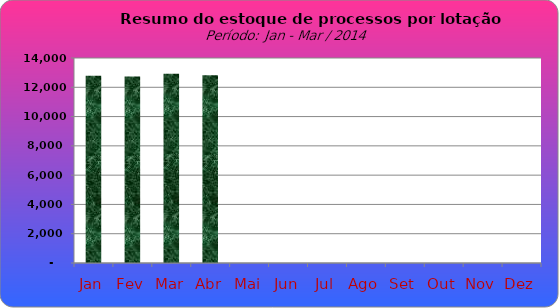
| Category | Series 0 |
|---|---|
| Jan | 12795 |
| Fev | 12744 |
| Mar | 12928 |
| Abr | 12816 |
| Mai | 0 |
| Jun | 0 |
| Jul | 0 |
| Ago | 0 |
| Set | 0 |
| Out | 0 |
| Nov | 0 |
| Dez | 0 |